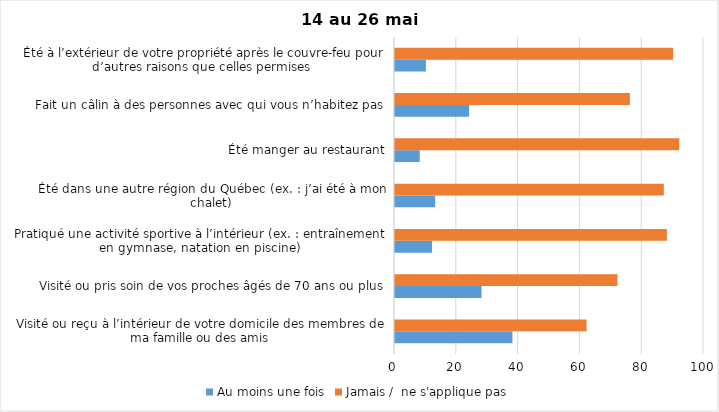
| Category | Au moins une fois | Jamais /  ne s'applique pas |
|---|---|---|
| Visité ou reçu à l’intérieur de votre domicile des membres de ma famille ou des amis | 38 | 62 |
| Visité ou pris soin de vos proches âgés de 70 ans ou plus | 28 | 72 |
| Pratiqué une activité sportive à l’intérieur (ex. : entraînement en gymnase, natation en piscine) | 12 | 88 |
| Été dans une autre région du Québec (ex. : j’ai été à mon chalet) | 13 | 87 |
| Été manger au restaurant | 8 | 92 |
| Fait un câlin à des personnes avec qui vous n’habitez pas | 24 | 76 |
| Été à l’extérieur de votre propriété après le couvre-feu pour d’autres raisons que celles permises  | 10 | 90 |